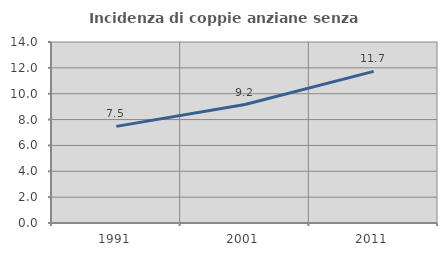
| Category | Incidenza di coppie anziane senza figli  |
|---|---|
| 1991.0 | 7.473 |
| 2001.0 | 9.161 |
| 2011.0 | 11.725 |